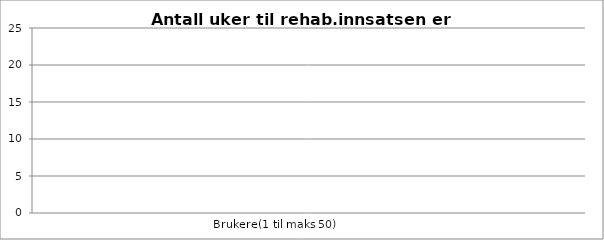
| Category | Antall uker før rehab. innsatsen er "inntjent" |
|---|---|
| 0 | 0 |
| 1 | 0 |
| 2 | 0 |
| 3 | 0 |
| 4 | 0 |
| 5 | 0 |
| 6 | 0 |
| 7 | 0 |
| 8 | 0 |
| 9 | 0 |
| 10 | 0 |
| 11 | 0 |
| 12 | 0 |
| 13 | 0 |
| 14 | 0 |
| 15 | 0 |
| 16 | 0 |
| 17 | 0 |
| 18 | 0 |
| 19 | 0 |
| 20 | 0 |
| 21 | 0 |
| 22 | 0 |
| 23 | 0 |
| 24 | 0 |
| 25 | 0 |
| 26 | 0 |
| 27 | 0 |
| 28 | 0 |
| 29 | 0 |
| 30 | 0 |
| 31 | 0 |
| 32 | 0 |
| 33 | 0 |
| 34 | 0 |
| 35 | 0 |
| 36 | 0 |
| 37 | 0 |
| 38 | 0 |
| 39 | 0 |
| 40 | 0 |
| 41 | 0 |
| 42 | 0 |
| 43 | 0 |
| 44 | 0 |
| 45 | 0 |
| 46 | 0 |
| 47 | 0 |
| 48 | 0 |
| 49 | 0 |